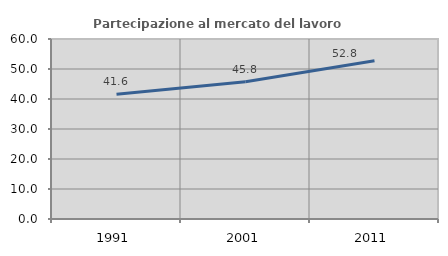
| Category | Partecipazione al mercato del lavoro  femminile |
|---|---|
| 1991.0 | 41.595 |
| 2001.0 | 45.752 |
| 2011.0 | 52.759 |